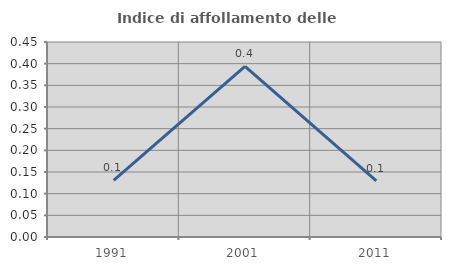
| Category | Indice di affollamento delle abitazioni  |
|---|---|
| 1991.0 | 0.131 |
| 2001.0 | 0.394 |
| 2011.0 | 0.129 |